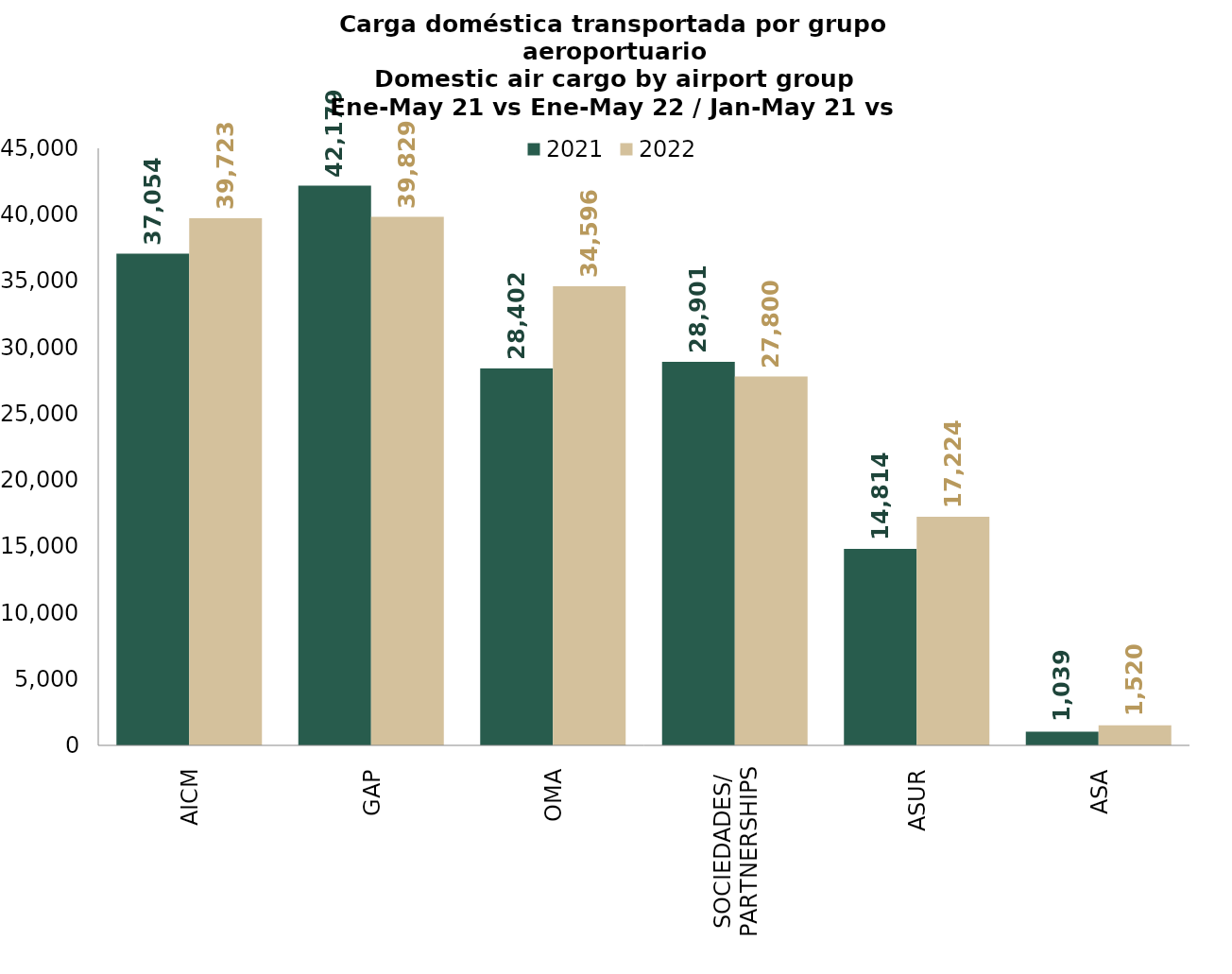
| Category | 2021 | 2022 |
|---|---|---|
| AICM | 37053.61 | 39723.034 |
| GAP | 42179.234 | 39829.153 |
| OMA | 28401.749 | 34595.979 |
| SOCIEDADES/
PARTNERSHIPS | 28901.164 | 27800.04 |
| ASUR | 14814.119 | 17224.417 |
| ASA | 1039.343 | 1519.531 |